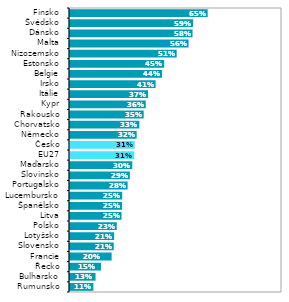
| Category | Series 0 |
|---|---|
| Rumunsko | 0.115 |
| Bulharsko | 0.125 |
| Řecko | 0.151 |
| Francie | 0.201 |
| Slovensko | 0.211 |
| Lotyšsko | 0.213 |
| Polsko | 0.225 |
| Litva | 0.248 |
| Španělsko | 0.25 |
| Lucembursko | 0.251 |
| Portugalsko | 0.277 |
| Slovinsko | 0.287 |
| Maďarsko | 0.298 |
| EU27 | 0.307 |
| Česko | 0.31 |
| Německo | 0.319 |
| Chorvatsko | 0.332 |
| Rakousko | 0.352 |
| Kypr | 0.362 |
| Itálie | 0.373 |
| Irsko | 0.408 |
| Belgie | 0.439 |
| Estonsko | 0.449 |
| Nizozemsko | 0.508 |
| Malta | 0.564 |
| Dánsko | 0.583 |
| Švédsko | 0.586 |
| Finsko | 0.654 |